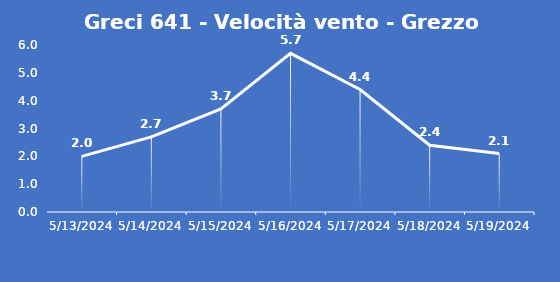
| Category | Greci 641 - Velocità vento - Grezzo (m/s) |
|---|---|
| 5/13/24 | 2 |
| 5/14/24 | 2.7 |
| 5/15/24 | 3.7 |
| 5/16/24 | 5.7 |
| 5/17/24 | 4.4 |
| 5/18/24 | 2.4 |
| 5/19/24 | 2.1 |